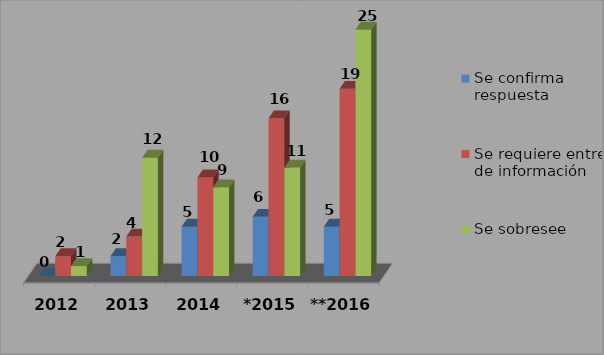
| Category | Se confirma respuesta | Se requiere entregar de información  | Se sobresee  |
|---|---|---|---|
| 2012 | 0 | 2 | 1 |
| 2013 | 2 | 4 | 12 |
| 2014 | 5 | 10 | 9 |
| *2015 | 6 | 16 | 11 |
| **2016 | 5 | 19 | 25 |